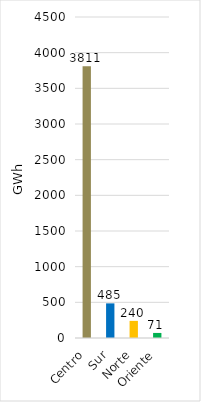
| Category | Series 0 |
|---|---|
| Centro | 3811.228 |
| Sur | 485.411 |
| Norte | 240.01 |
| Oriente | 70.957 |